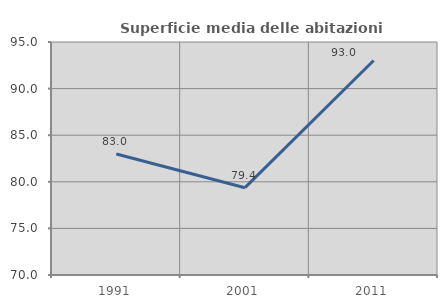
| Category | Superficie media delle abitazioni occupate |
|---|---|
| 1991.0 | 82.983 |
| 2001.0 | 79.368 |
| 2011.0 | 93.012 |